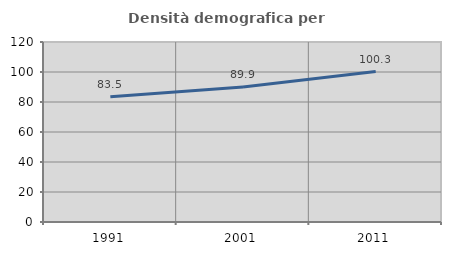
| Category | Densità demografica |
|---|---|
| 1991.0 | 83.526 |
| 2001.0 | 89.94 |
| 2011.0 | 100.293 |